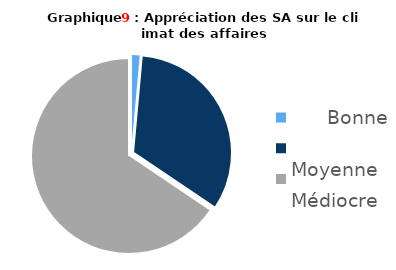
| Category | SA |
|---|---|
|       Bonne | 0.014 |
|       Moyenne | 0.319 |
|       Médiocre | 0.634 |